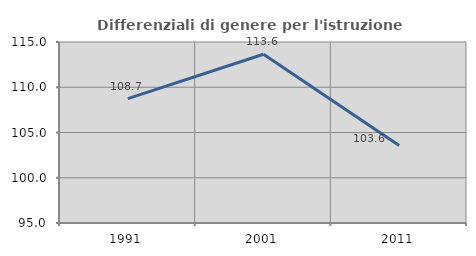
| Category | Differenziali di genere per l'istruzione superiore |
|---|---|
| 1991.0 | 108.747 |
| 2001.0 | 113.648 |
| 2011.0 | 103.571 |